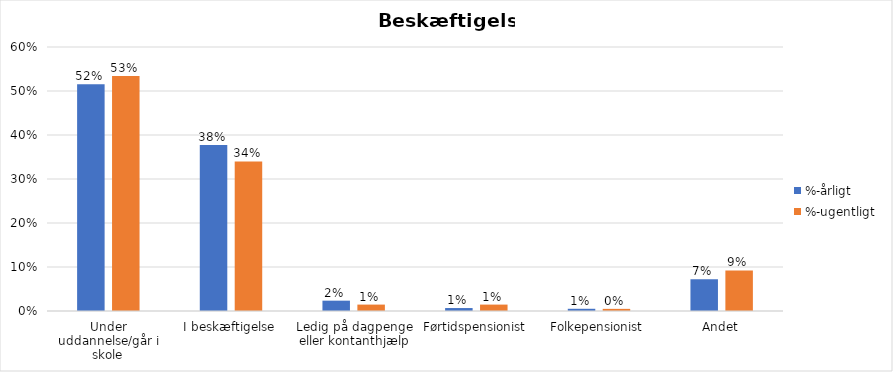
| Category | %-årligt | %-ugentligt |
|---|---|---|
| Under uddannelse/går i skole | 0.515 | 0.534 |
| I beskæftigelse | 0.378 | 0.34 |
| Ledig på dagpenge eller kontanthjælp | 0.023 | 0.015 |
| Førtidspensionist | 0.007 | 0.015 |
| Folkepensionist | 0.005 | 0.005 |
| Andet | 0.072 | 0.092 |